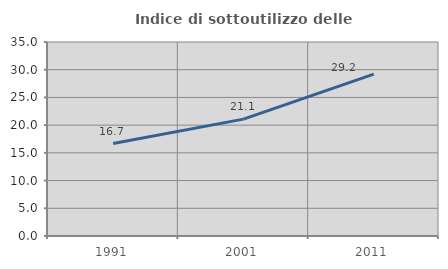
| Category | Indice di sottoutilizzo delle abitazioni  |
|---|---|
| 1991.0 | 16.684 |
| 2001.0 | 21.089 |
| 2011.0 | 29.209 |